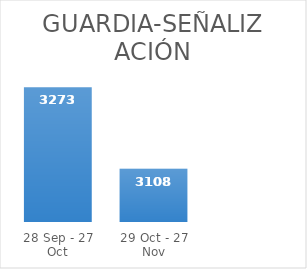
| Category | Series 0 |
|---|---|
| 28 Sep - 27 Oct | 3273 |
| 29 Oct - 27 Nov | 3108 |